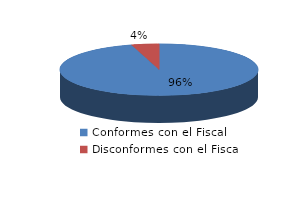
| Category | Series 0 |
|---|---|
| 0 | 746 |
| 1 | 35 |